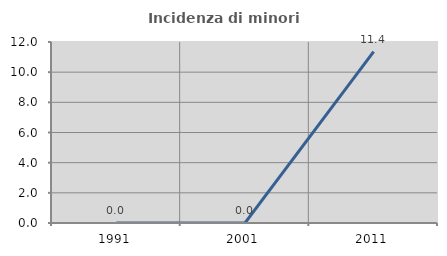
| Category | Incidenza di minori stranieri |
|---|---|
| 1991.0 | 0 |
| 2001.0 | 0 |
| 2011.0 | 11.364 |